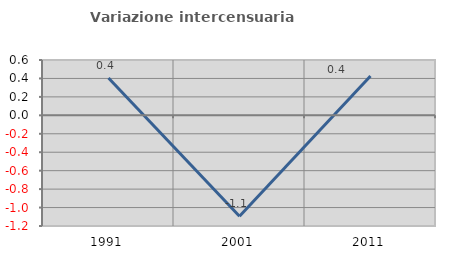
| Category | Variazione intercensuaria annua |
|---|---|
| 1991.0 | 0.405 |
| 2001.0 | -1.095 |
| 2011.0 | 0.426 |